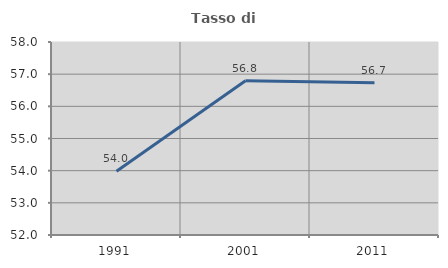
| Category | Tasso di occupazione   |
|---|---|
| 1991.0 | 53.984 |
| 2001.0 | 56.798 |
| 2011.0 | 56.732 |